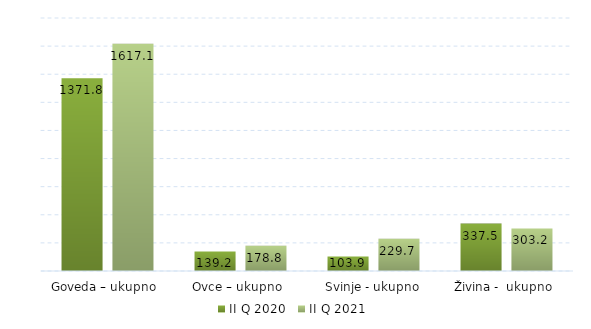
| Category | II Q 2020 | II Q 2021 |
|---|---|---|
| Goveda – ukupno  | 1371.8 | 1617.113 |
| Ovce – ukupno  | 139.2 | 178.8 |
| Svinje - ukupno | 103.9 | 229.661 |
| Živina -  ukupno  | 337.5 | 303.175 |